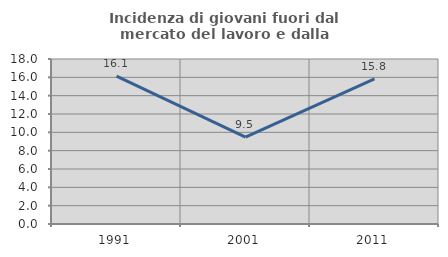
| Category | Incidenza di giovani fuori dal mercato del lavoro e dalla formazione  |
|---|---|
| 1991.0 | 16.129 |
| 2001.0 | 9.467 |
| 2011.0 | 15.842 |